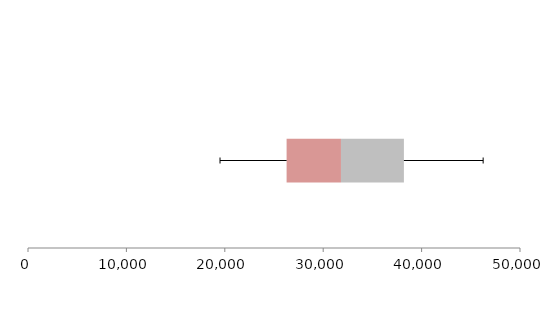
| Category | Series 1 | Series 2 | Series 3 |
|---|---|---|---|
| 0 | 26280.538 | 5525.543 | 6395.48 |